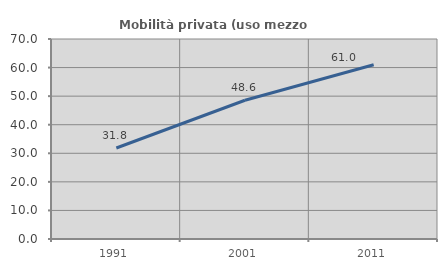
| Category | Mobilità privata (uso mezzo privato) |
|---|---|
| 1991.0 | 31.845 |
| 2001.0 | 48.56 |
| 2011.0 | 61.003 |